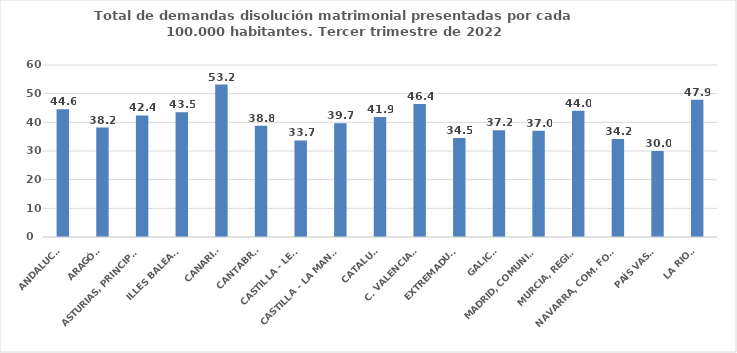
| Category | Series 0 |
|---|---|
| ANDALUCÍA | 44.575 |
| ARAGÓN | 38.179 |
| ASTURIAS, PRINCIPADO | 42.409 |
| ILLES BALEARS | 43.528 |
| CANARIAS | 53.161 |
| CANTABRIA | 38.789 |
| CASTILLA - LEÓN | 33.67 |
| CASTILLA - LA MANCHA | 39.665 |
| CATALUÑA | 41.897 |
| C. VALENCIANA | 46.358 |
| EXTREMADURA | 34.527 |
| GALICIA | 37.224 |
| MADRID, COMUNIDAD | 37.038 |
| MURCIA, REGIÓN | 44.011 |
| NAVARRA, COM. FORAL | 34.207 |
| PAÍS VASCO | 29.993 |
| LA RIOJA | 47.89 |